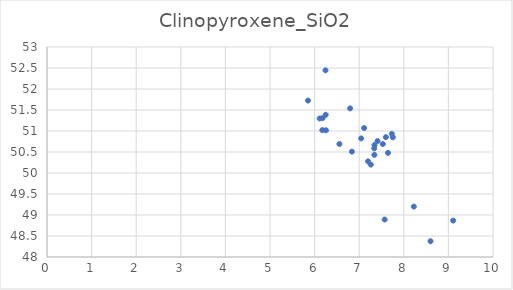
| Category | Clinopyroxene_SiO2 |
|---|---|
| 6.25454844811733 | 51.017 |
| 6.17299501636454 | 51.021 |
| 6.11360997413384 | 51.299 |
| 6.79612958843037 | 51.539 |
| 6.24868735558877 | 51.386 |
| 8.22435435895915 | 49.2 |
| 7.57109373324875 | 48.892 |
| 8.59887351759858 | 48.376 |
| 9.10762306810655 | 48.867 |
| 7.64591324065765 | 50.479 |
| 7.53037781037739 | 50.69 |
| 7.04451911793689 | 50.823 |
| 7.59830119800477 | 50.854 |
| 6.55555725273624 | 50.691 |
| 7.33744794651589 | 50.587 |
| 7.75391611334159 | 50.85 |
| 7.11019448941886 | 51.071 |
| 7.4106852654992 | 50.76 |
| 7.34258697184952 | 50.665 |
| 7.25958787336384 | 50.2 |
| 7.73128822420509 | 50.931 |
| 6.83633084048357 | 50.51 |
| 7.19884015917267 | 50.277 |
| 7.33982582867008 | 50.432 |
| 6.17852996734405 | 51.307 |
| 6.2445675301451 | 52.445 |
| 5.85132843699623 | 51.725 |